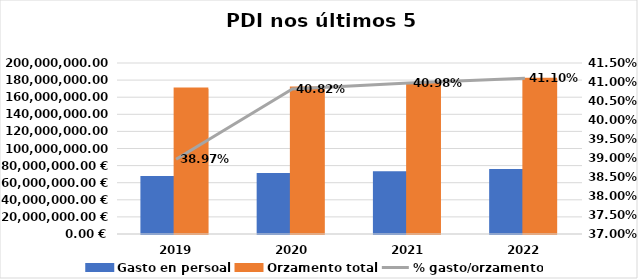
| Category | Gasto en persoal | Orzamento total |
|---|---|---|
| 2019.0 | 66138863.12 | 169720733.3 |
| 2020.0 | 69666572.955 | 170681126.09 |
| 2021.0 | 71760878.7 | 175131206.4 |
| 2022.0 | 74385998.07 | 180980048.67 |